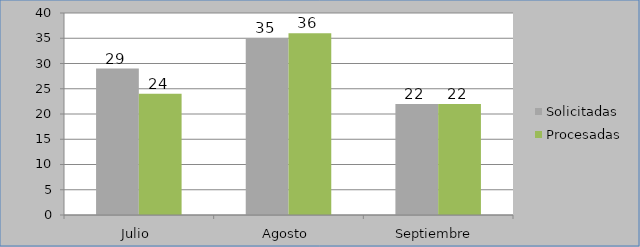
| Category | Solicitadas | Procesadas |
|---|---|---|
| Julio  | 29 | 24 |
| Agosto  | 35 | 36 |
| Septiembre  | 22 | 22 |